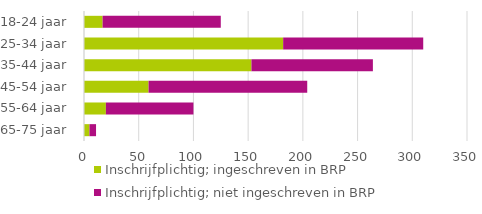
| Category | Inschrijfplichtig; ingeschreven in BRP | Inschrijfplichtig; niet ingeschreven in BRP |
|---|---|---|
| 65-75 jaar | 5 | 6 |
| 55-64 jaar | 20 | 80 |
| 45-54 jaar | 59 | 145 |
| 35-44 jaar | 153 | 111 |
| 25-34 jaar | 182 | 128 |
| 18-24 jaar | 17 | 108 |